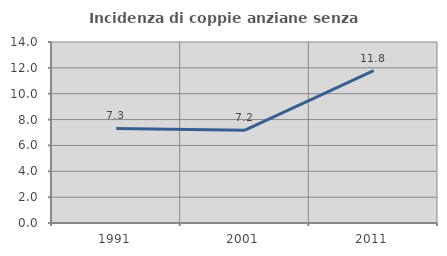
| Category | Incidenza di coppie anziane senza figli  |
|---|---|
| 1991.0 | 7.314 |
| 2001.0 | 7.183 |
| 2011.0 | 11.792 |